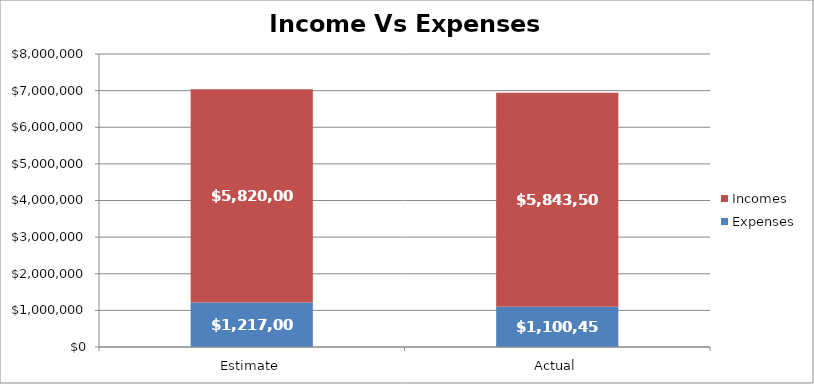
| Category | Expenses | Incomes |
|---|---|---|
| Estimate | 1217000 | 5820000 |
| Actual | 1100450 | 5843500 |